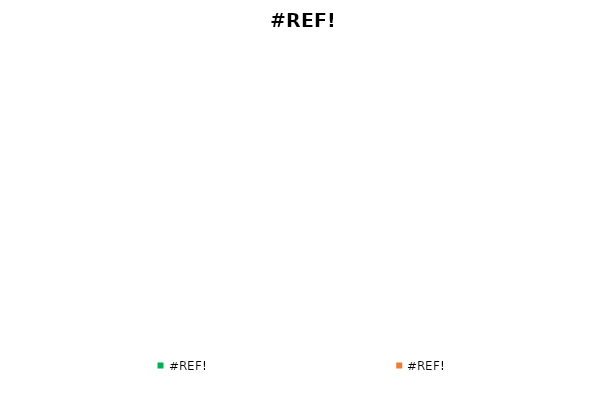
| Category | #ССЫЛКА! |
|---|---|
| 0.0 | 0 |
| 0.0 | 0 |